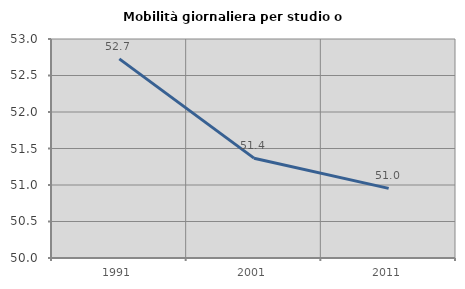
| Category | Mobilità giornaliera per studio o lavoro |
|---|---|
| 1991.0 | 52.728 |
| 2001.0 | 51.368 |
| 2011.0 | 50.954 |